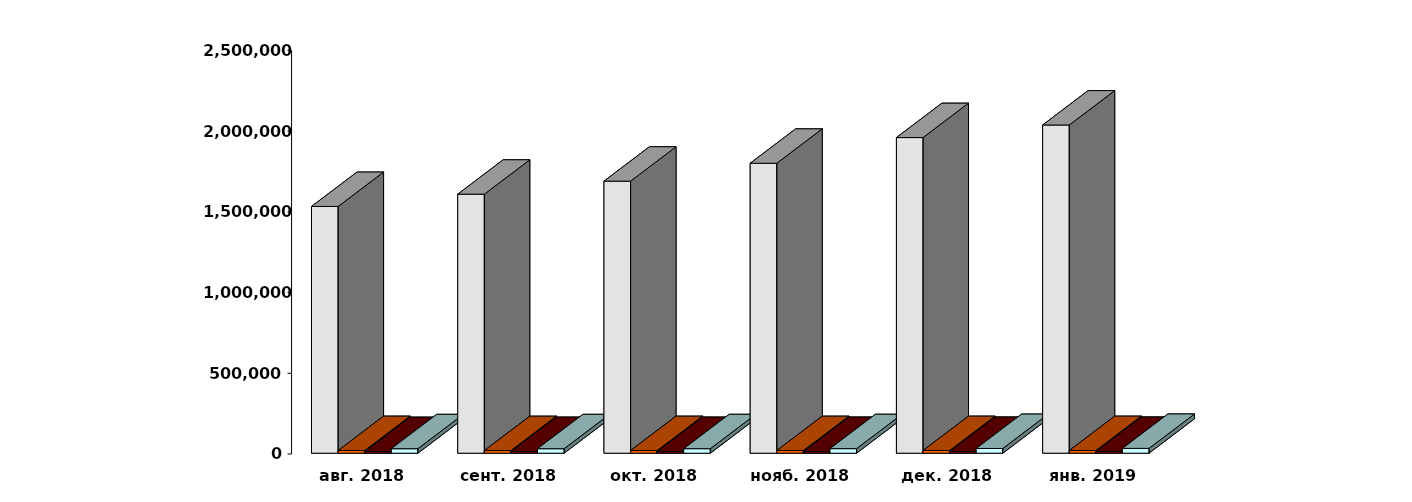
| Category | Физические лица | Юридические лица | Иностранные лица | Клиенты, передавшие свои средства в ДУ |
|---|---|---|---|---|
| 2018-08-30 | 1528413 | 16598 | 10546 | 27858 |
| 2018-09-30 | 1604456 | 16427 | 10655 | 27795 |
| 2018-10-30 | 1685168 | 16513 | 10989 | 28000 |
| 2018-11-30 | 1796071 | 16547 | 11151 | 28275 |
| 2018-12-31 | 1955118 | 16631 | 11453 | 29262 |
| 2019-01-31 | 2032931 | 16590 | 11564 | 29851 |